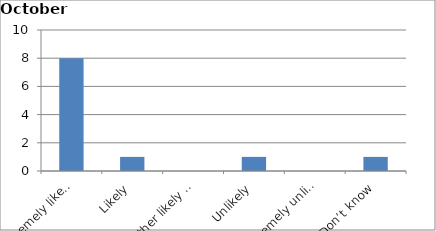
| Category | Series 0 |
|---|---|
| Extremely likely | 8 |
| Likely | 1 |
| Neither likely nor unlikely | 0 |
| Unlikely | 1 |
| Extremely unlikely | 0 |
| Don’t know | 1 |